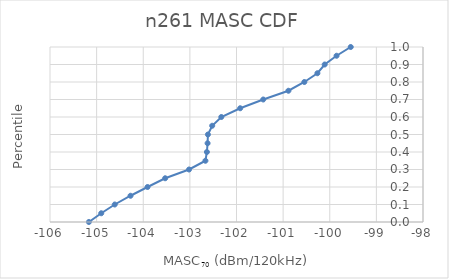
| Category | n261 |
|---|---|
| -105.16616962510335 | 0 |
| -104.90086785004134 | 0.05 |
| -104.6112 | 0.1 |
| -104.2728 | 0.15 |
| -103.908 | 0.2 |
| -103.53 | 0.25 |
| -103.01784 | 0.3 |
| -102.6661 | 0.35 |
| -102.6352 | 0.4 |
| -102.62014365105853 | 0.45 |
| -102.61300912764634 | 0.5 |
| -102.52120365105853 | 0.55 |
| -102.32531110898779 | 0.6 |
| -101.92124443595121 | 0.65 |
| -101.4264133269634 | 0.7 |
| -100.8862 | 0.75 |
| -100.54456 | 0.8 |
| -100.26476 | 0.85 |
| -100.10864000000001 | 0.9 |
| -99.85396 | 0.95 |
| -99.55 | 1 |